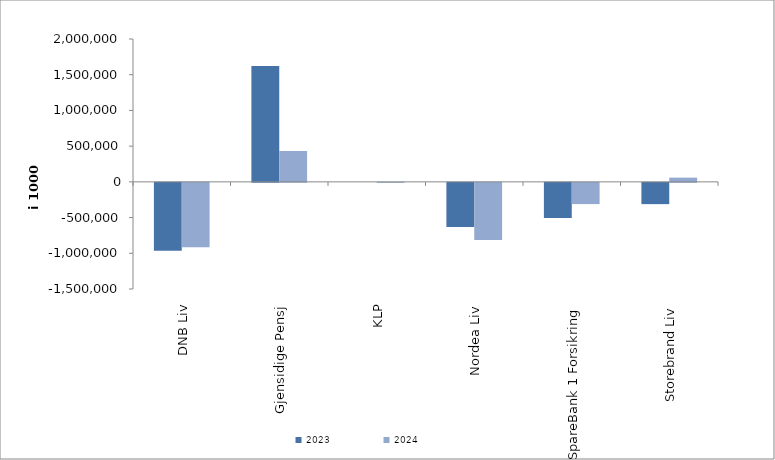
| Category | 2023 | 2024 |
|---|---|---|
| DNB Liv | -951646 | -900203 |
| Gjensidige Pensj | 1621849 | 432876 |
| KLP | 0 | -182.055 |
| Nordea Liv | -618652.86 | -799067.743 |
| SpareBank 1 Forsikring | -493333.321 | -297184.52 |
| Storebrand Liv | -297882.168 | 59260.881 |